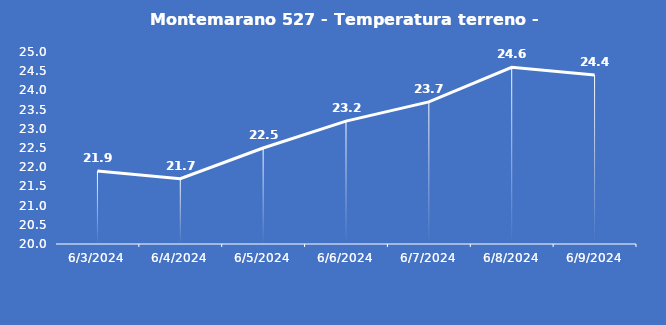
| Category | Montemarano 527 - Temperatura terreno - Grezzo (°C) |
|---|---|
| 6/3/24 | 21.9 |
| 6/4/24 | 21.7 |
| 6/5/24 | 22.5 |
| 6/6/24 | 23.2 |
| 6/7/24 | 23.7 |
| 6/8/24 | 24.6 |
| 6/9/24 | 24.4 |